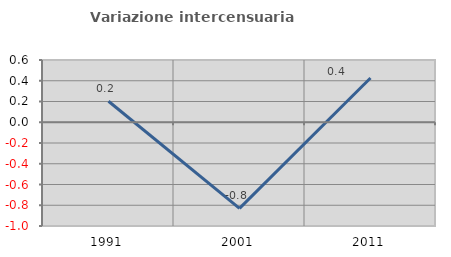
| Category | Variazione intercensuaria annua |
|---|---|
| 1991.0 | 0.202 |
| 2001.0 | -0.83 |
| 2011.0 | 0.427 |